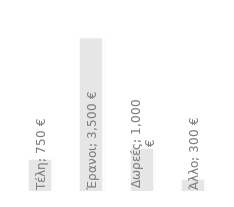
| Category | Ετήσια έσοδα |
|---|---|
| Τέλη | 750 |
| Έρανοι | 3500 |
| Δωρεές | 1000 |
| Άλλο | 300 |